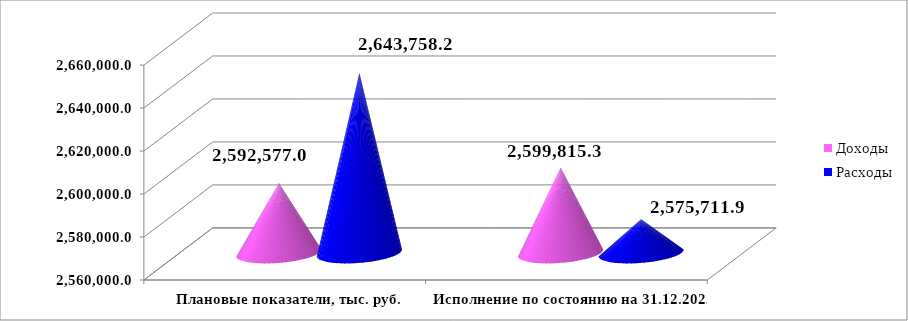
| Category | Доходы | Расходы |
|---|---|---|
| Плановые показатели, тыс. руб. | 2592577 | 2643758.2 |
| Исполнение по состоянию на 31.12.2022, тыс.руб. | 2599815.3 | 2575711.9 |